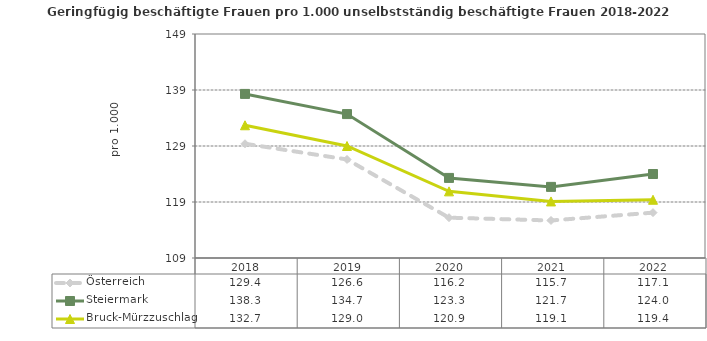
| Category | Österreich | Steiermark | Bruck-Mürzzuschlag |
|---|---|---|---|
| 2022.0 | 117.1 | 124 | 119.4 |
| 2021.0 | 115.7 | 121.7 | 119.1 |
| 2020.0 | 116.2 | 123.3 | 120.9 |
| 2019.0 | 126.6 | 134.7 | 129 |
| 2018.0 | 129.4 | 138.3 | 132.7 |